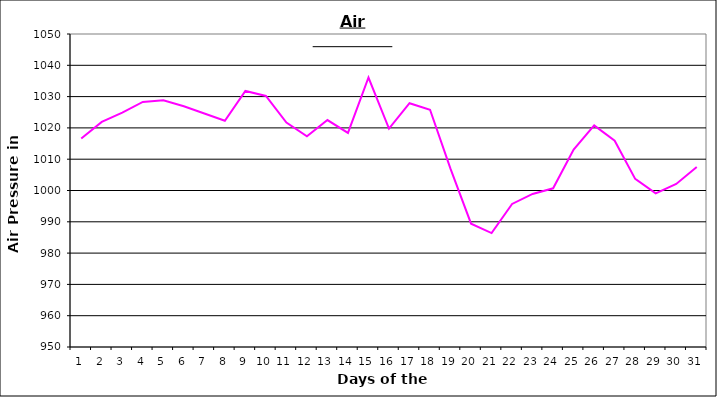
| Category | Series 0 |
|---|---|
| 0 | 1016.6 |
| 1 | 1021.9 |
| 2 | 1024.9 |
| 3 | 1028.3 |
| 4 | 1028.8 |
| 5 | 1026.9 |
| 6 | 1024.6 |
| 7 | 1022.3 |
| 8 | 1031.8 |
| 9 | 1030.2 |
| 10 | 1021.7 |
| 11 | 1017.3 |
| 12 | 1022.5 |
| 13 | 1018.4 |
| 14 | 1036.1 |
| 15 | 1019.8 |
| 16 | 1027.9 |
| 17 | 1025.8 |
| 18 | 1006.9 |
| 19 | 989.4 |
| 20 | 986.4 |
| 21 | 995.7 |
| 22 | 998.9 |
| 23 | 1000.7 |
| 24 | 1013.1 |
| 25 | 1020.8 |
| 26 | 1015.9 |
| 27 | 1003.7 |
| 28 | 999.1 |
| 29 | 1002.1 |
| 30 | 1007.5 |